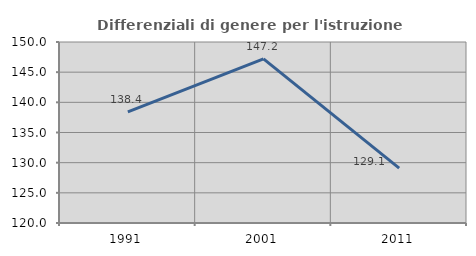
| Category | Differenziali di genere per l'istruzione superiore |
|---|---|
| 1991.0 | 138.43 |
| 2001.0 | 147.192 |
| 2011.0 | 129.097 |